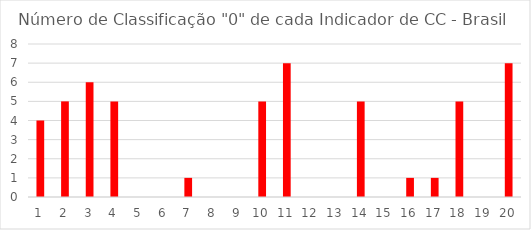
| Category | Series 0 |
|---|---|
| 0 | 4 |
| 1 | 5 |
| 2 | 6 |
| 3 | 5 |
| 4 | 0 |
| 5 | 0 |
| 6 | 1 |
| 7 | 0 |
| 8 | 0 |
| 9 | 5 |
| 10 | 7 |
| 11 | 0 |
| 12 | 0 |
| 13 | 5 |
| 14 | 0 |
| 15 | 1 |
| 16 | 1 |
| 17 | 5 |
| 18 | 0 |
| 19 | 7 |